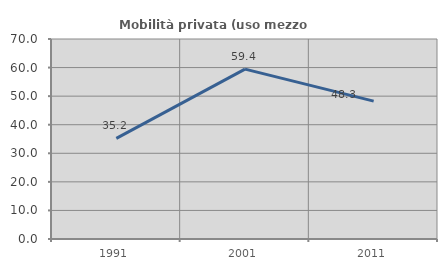
| Category | Mobilità privata (uso mezzo privato) |
|---|---|
| 1991.0 | 35.227 |
| 2001.0 | 59.447 |
| 2011.0 | 48.259 |